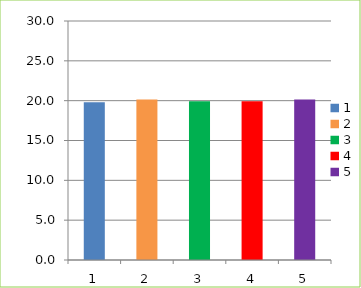
| Category | Series 0 |
|---|---|
| 0 | 19.8 |
| 1 | 20.162 |
| 2 | 19.938 |
| 3 | 19.938 |
| 4 | 20.162 |